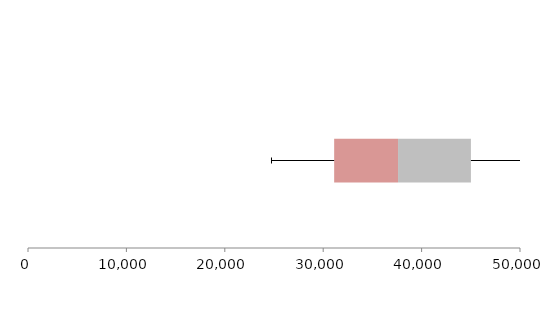
| Category | Series 1 | Series 2 | Series 3 |
|---|---|---|---|
| 0 | 31114.193 | 6490.752 | 7407.514 |